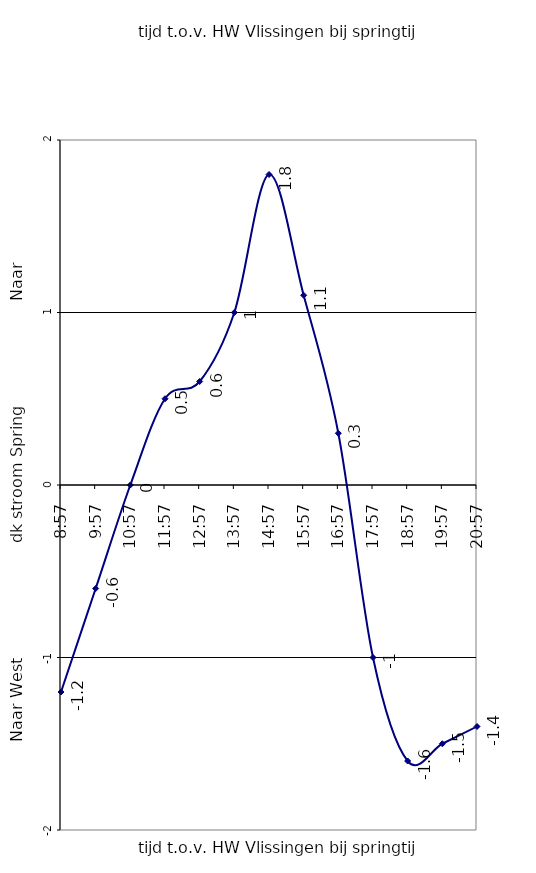
| Category | Series 0 |
|---|---|
| 1900-01-06 08:57:00 | -1.2 |
| 1900-01-05 09:57:00 | -0.6 |
| 1900-01-04 10:57:00 | 0 |
| 1900-01-03 11:57:00 | 0.5 |
| 1900-01-02 12:57:00 | 0.6 |
| 1900-01-01 13:57:00 | 1 |
| 0.6229166666666667 | 1.8 |
| 1900-01-01 15:57:00 | 1.1 |
| 1900-01-02 16:57:00 | 0.3 |
| 1900-01-03 17:57:00 | -1 |
| 1900-01-04 18:57:00 | -1.6 |
| 1900-01-05 19:57:00 | -1.5 |
| 1900-01-06 20:57:00 | -1.4 |